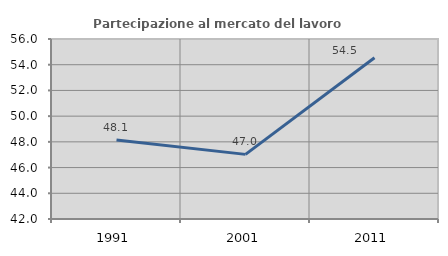
| Category | Partecipazione al mercato del lavoro  femminile |
|---|---|
| 1991.0 | 48.148 |
| 2001.0 | 47.027 |
| 2011.0 | 54.545 |